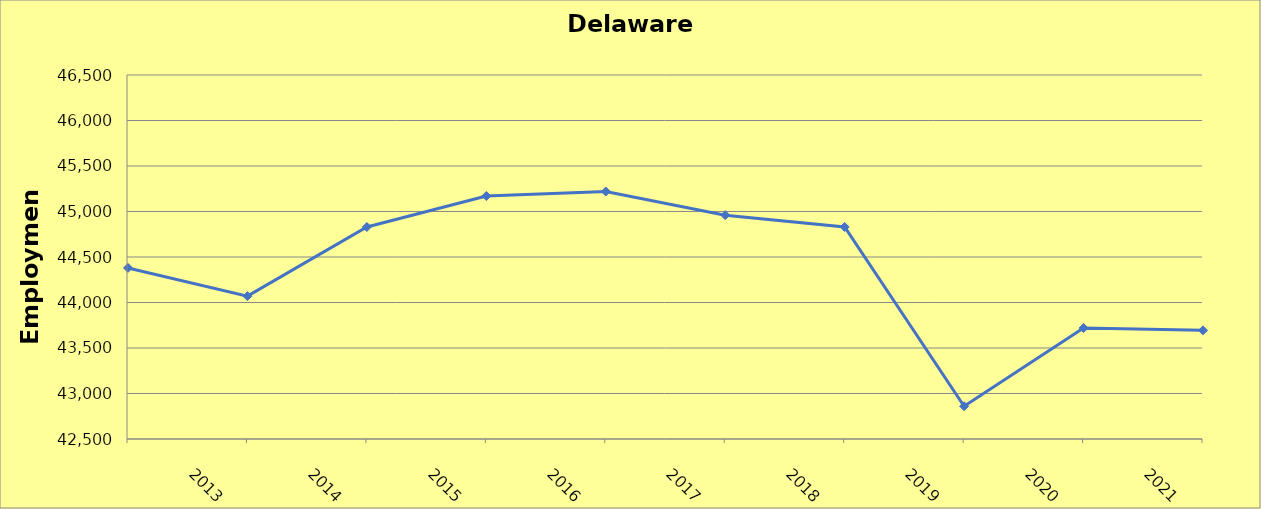
| Category | Delaware County |
|---|---|
| 2013.0 | 44380 |
| 2014.0 | 44070 |
| 2015.0 | 44830 |
| 2016.0 | 45170 |
| 2017.0 | 45220 |
| 2018.0 | 44960 |
| 2019.0 | 44830 |
| 2020.0 | 42860 |
| 2021.0 | 43720 |
| 2022.0 | 43694 |